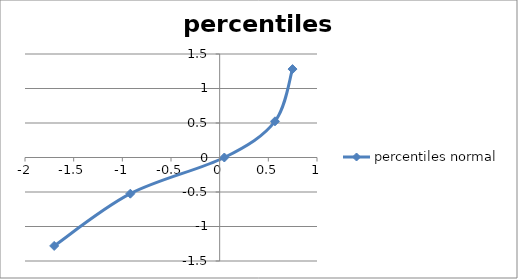
| Category | percentiles normal |
|---|---|
| -1.7001754696368514 | -1.282 |
| -0.9179346406090965 | -0.524 |
| 0.04787248603388457 | 0 |
| 0.568079156023285 | 0.524 |
| 0.7485446798551976 | 1.282 |